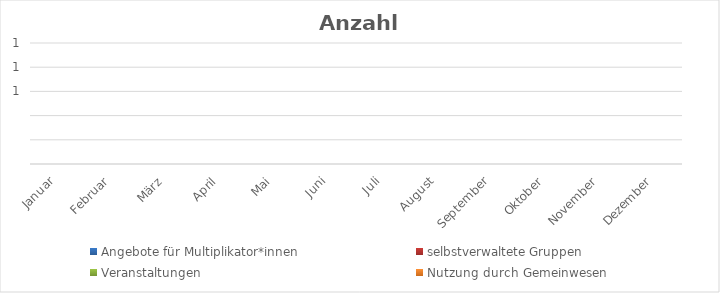
| Category | Angebote für Multiplikator*innen | selbstverwaltete Gruppen | Veranstaltungen | Nutzung durch Gemeinwesen |
|---|---|---|---|---|
| Januar | 0 | 0 | 0 | 0 |
| Februar | 0 | 0 | 0 | 0 |
| März | 0 | 0 | 0 | 0 |
| April | 0 | 0 | 0 | 0 |
| Mai | 0 | 0 | 0 | 0 |
| Juni | 0 | 0 | 0 | 0 |
| Juli | 0 | 0 | 0 | 0 |
| August | 0 | 0 | 0 | 0 |
| September | 0 | 0 | 0 | 0 |
| Oktober | 0 | 0 | 0 | 0 |
| November | 0 | 0 | 0 | 0 |
| Dezember | 0 | 0 | 0 | 0 |